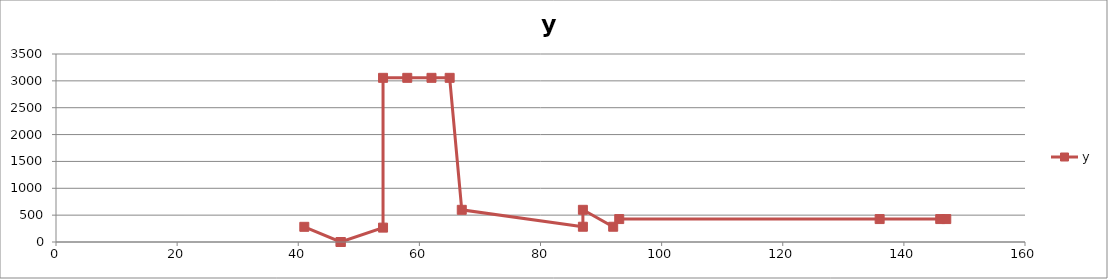
| Category | y |
|---|---|
| 41.0 | 282.557 |
| 47.0 | 0 |
| 47.0 | 0 |
| 54.0 | 267.666 |
| 54.0 | 3056.164 |
| 58.0 | 3056.164 |
| 62.0 | 3056.164 |
| 65.0 | 3056.164 |
| 67.0 | 599.197 |
| 87.0 | 284.137 |
| 87.0 | 599.197 |
| 92.0 | 284.137 |
| 93.0 | 426.849 |
| 136.0 | 426.849 |
| 146.0 | 426.849 |
| 147.0 | 426.849 |